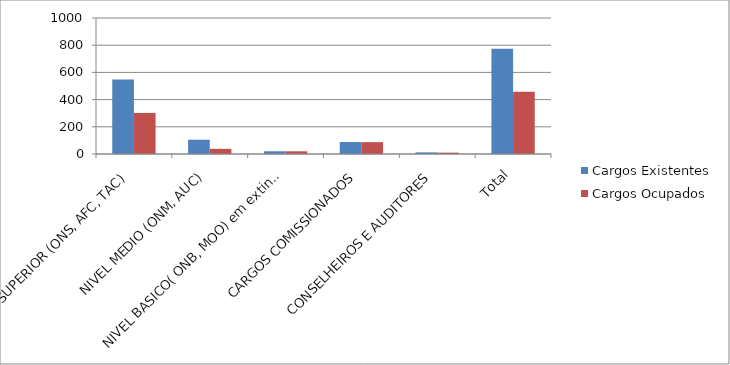
| Category | Cargos Existentes | Cargos Ocupados |
|---|---|---|
| NIVEL SUPERIOR (ONS, AFC, TAC) | 548 | 302 |
| NIVEL MEDIO (ONM, AUC) | 105 | 38 |
| NIVEL BASICO( ONB, MOO) em extinção | 20 | 20 |
| CARGOS COMISSIONADOS | 88 | 87 |
| CONSELHEIROS E AUDITORES | 12 | 10 |
| Total | 773 | 457 |